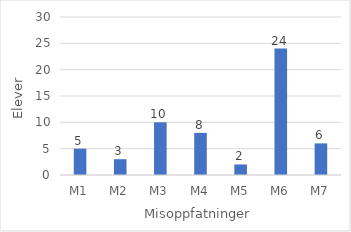
| Category | Series 0 |
|---|---|
| M1 | 5 |
| M2 | 3 |
| M3 | 10 |
| M4 | 8 |
| M5 | 2 |
| M6 | 24 |
| M7 | 6 |